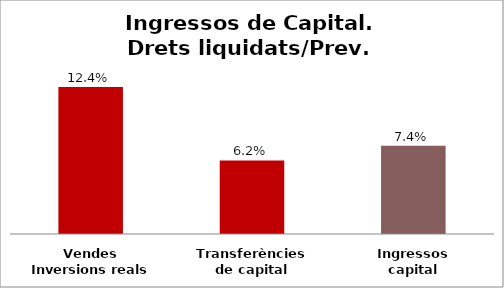
| Category | Series 0 |
|---|---|
| Vendes Inversions reals | 0.124 |
| Transferències de capital | 0.062 |
| Ingressos capital | 0.074 |